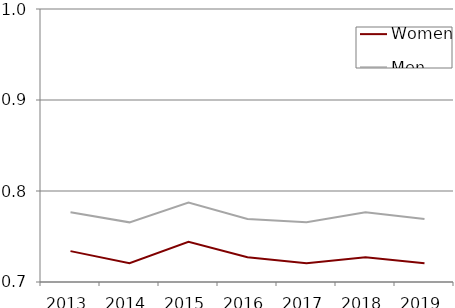
| Category | Women | Men |
|---|---|---|
| 2013.0 | 0.734 | 0.777 |
| 2014.0 | 0.721 | 0.766 |
| 2015.0 | 0.744 | 0.787 |
| 2016.0 | 0.727 | 0.769 |
| 2017.0 | 0.721 | 0.766 |
| 2018.0 | 0.727 | 0.777 |
| 2019.0 | 0.721 | 0.769 |